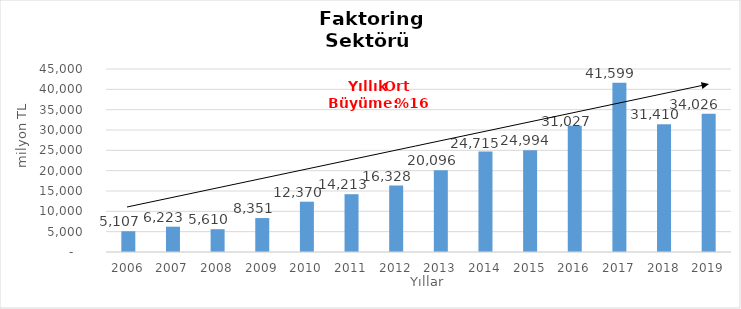
| Category | Faktoring  |
|---|---|
| 2006.0 | 5107.149 |
| 2007.0 | 6222.508 |
| 2008.0 | 5610.293 |
| 2009.0 | 8350.82 |
| 2010.0 | 12369.836 |
| 2011.0 | 14213.285 |
| 2012.0 | 16327.829 |
| 2013.0 | 20095.909 |
| 2014.0 | 24715 |
| 2015.0 | 24994 |
| 2016.0 | 31027 |
| 2017.0 | 41599 |
| 2018.0 | 31410 |
| 2019.0 | 34026 |